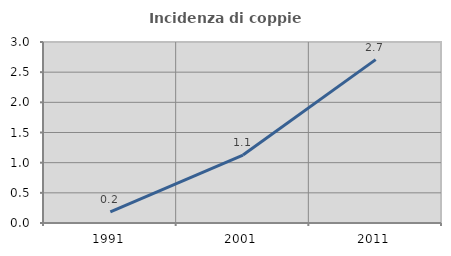
| Category | Incidenza di coppie miste |
|---|---|
| 1991.0 | 0.186 |
| 2001.0 | 1.127 |
| 2011.0 | 2.708 |